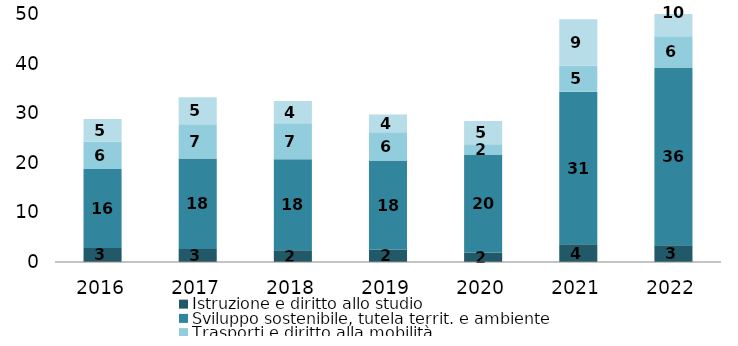
| Category | Istruzione e diritto allo studio | Sviluppo sostenibile, tutela territ. e ambiente | Trasporti e diritto alla mobilità | Diritti sociali, politiche sociali e famiglia |
|---|---|---|---|---|
| 2016.0 | 2.823 | 15.925 | 5.524 | 4.563 |
| 2017.0 | 2.616 | 18.25 | 6.886 | 5.449 |
| 2018.0 | 2.347 | 18.368 | 7.238 | 4.485 |
| 2019.0 | 2.495 | 17.976 | 5.7 | 3.552 |
| 2020.0 | 1.909 | 19.757 | 2.065 | 4.683 |
| 2021.0 | 3.574 | 30.734 | 5.263 | 9.389 |
| 2022.0 | 3.366 | 35.863 | 6.287 | 9.566 |